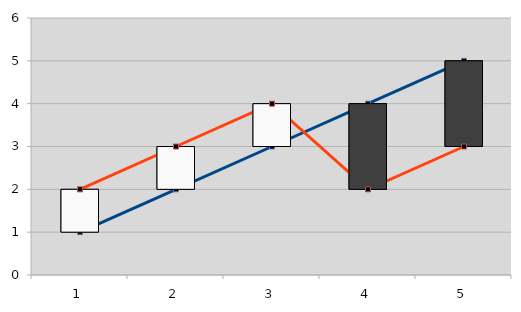
| Category | Series 0 | Series 1 | Series 2 |
|---|---|---|---|
| 0 | 1 | 2 |  |
| 1 | 2 | 3 |  |
| 2 | 3 | 4 |  |
| 3 | 4 | 2 |  |
| 4 | 5 | 3 |  |